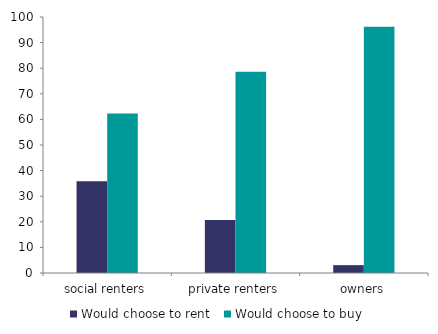
| Category | Would choose to rent  | Series 1 | Would choose to buy |
|---|---|---|---|
| social renters | 35.85 |  | 62.275 |
| private renters | 20.735 |  | 78.646 |
| owners | 3.07 |  | 96.194 |